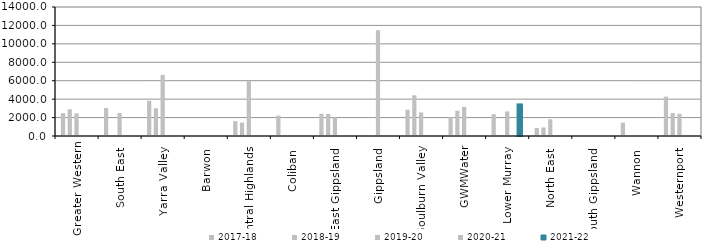
| Category | 2017-18 | 2018-19 | 2019-20 | 2020-21 | 2021-22 |
|---|---|---|---|---|---|
| Greater Western | 2477.222 | 2899.296 | 2464.667 | 0 | 0 |
| South East  | 3030 | 0 | 2501 | 0 | 0 |
| Yarra Valley  | 3829 | 3012.66 | 6628 | 0 | 0 |
| Barwon  | 0 | 0 | 0 | 0 | 0 |
| Central Highlands  | 1613 | 1460 | 5949 | 0 | 0 |
| Coliban  | 2211.56 | 0 | 0 | 0 | 0 |
| East Gippsland  | 2412 | 2388 | 2016.18 | 0 | 0 |
| Gippsland  | 0 | 0 | 11477.84 | 0 | 0 |
| Goulburn Valley  | 2860 | 4420.53 | 2557.45 | 0 | 0 |
| GWMWater | 2034.195 | 2740 | 3159.116 | 0 | 0 |
| Lower Murray  | 2371.45 | 0 | 2671 | 0 | 3321.63 |
| North East  | 871 | 926.51 | 1813.93 | 0 | 0 |
| South Gippsland  | 0 | 0 | 0 | 0 | 0 |
| Wannon  | 1437 | 0 | 0 | 0 | 0 |
| Westernport  | 4270 | 2483 | 2414 | 0 | 0 |